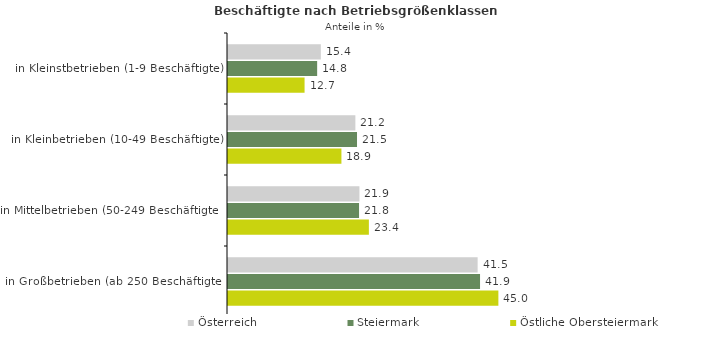
| Category | Österreich | Steiermark | Östliche Obersteiermark |
|---|---|---|---|
| in Kleinstbetrieben (1-9 Beschäftigte) | 15.439 | 14.827 | 12.735 |
| in Kleinbetrieben (10-49 Beschäftigte) | 21.184 | 21.458 | 18.865 |
| in Mittelbetrieben (50-249 Beschäftigte) | 21.859 | 21.796 | 23.43 |
| in Großbetrieben (ab 250 Beschäftigte) | 41.518 | 41.919 | 44.97 |